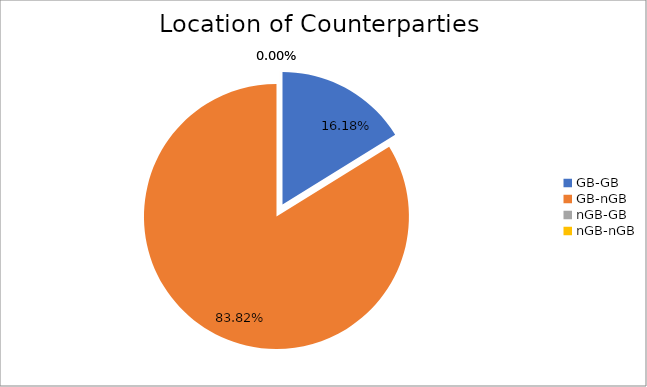
| Category | Series 0 |
|---|---|
| GB-GB | 1585341.056 |
| GB-nGB | 8213929.436 |
| nGB-GB | 0 |
| nGB-nGB | 82.64 |